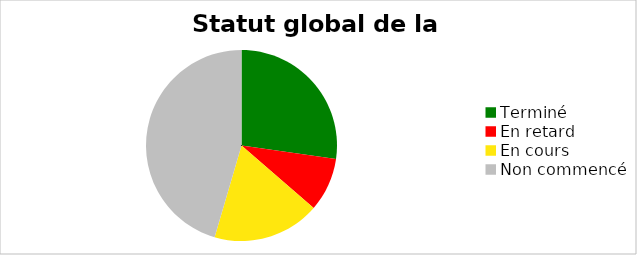
| Category | Series 0 |
|---|---|
| Terminé | 0.273 |
| En retard | 0.091 |
| En cours | 0.182 |
| Non commencé | 0.455 |